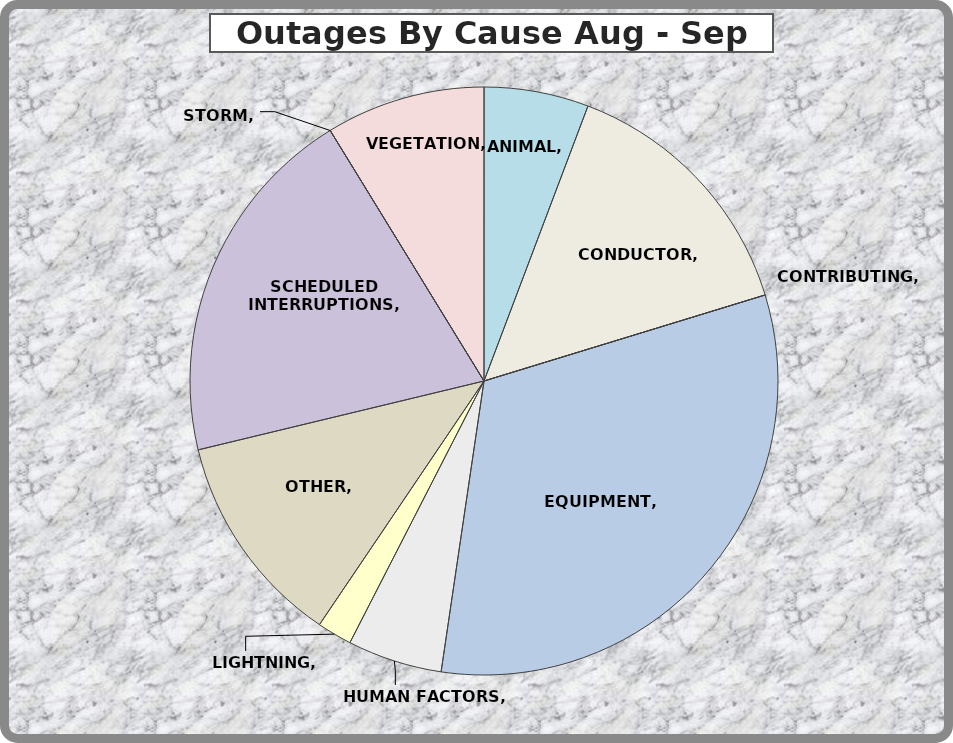
| Category | Series 0 |
|---|---|
| ANIMAL | 21 |
| CONDUCTOR | 53 |
| CONTRIBUTING | 0 |
| EQUIPMENT | 117 |
| HUMAN FACTORS | 19 |
| LIGHTNING | 7 |
| OTHER | 43 |
| SCHEDULED INTERRUPTIONS | 73 |
| STORM | 0 |
| VEGETATION | 32 |